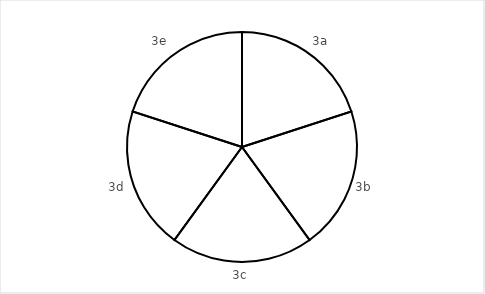
| Category | Sector weight |
|---|---|
| 3a | 1 |
| 3b | 1 |
| 3c | 1 |
| 3d | 1 |
| 3e | 1 |